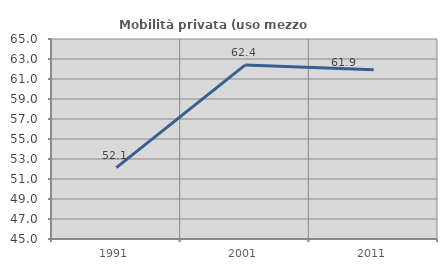
| Category | Mobilità privata (uso mezzo privato) |
|---|---|
| 1991.0 | 52.142 |
| 2001.0 | 62.39 |
| 2011.0 | 61.935 |